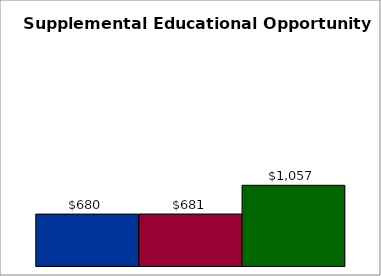
| Category | 50 states and D.C. | SREB states | State |
|---|---|---|---|
| 0 | 679.854 | 681.056 | 1057.434 |